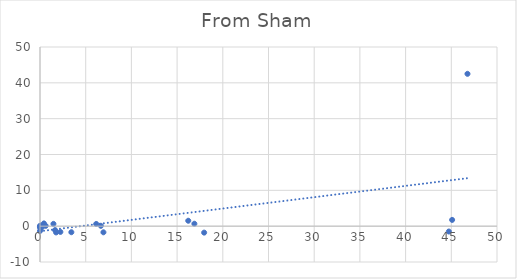
| Category | Series 0 |
|---|---|
| 44.73 | -1.496 |
| 17.96 | -1.803 |
| 6.94 | -1.713 |
| 3.43 | -1.687 |
| 2.23 | -1.607 |
| 1.76 | -1.746 |
| 0.0 | 0 |
| 0.0 | -1.333 |
| 45.09 | 1.749 |
| 16.89 | 0.68 |
| 6.15 | 0.62 |
| 1.47 | 0.643 |
| 0.43 | 0.763 |
| 0.1 | 0.183 |
| 0.0 | 0 |
| 0.0 | -0.027 |
| 46.77 | 42.514 |
| 16.22 | 1.512 |
| 6.66 | 0.098 |
| 1.65 | -1.095 |
| 0.62 | 0.094 |
| 0.17 | -0.415 |
| 0.0 | 0 |
| 0.0 | -0.435 |